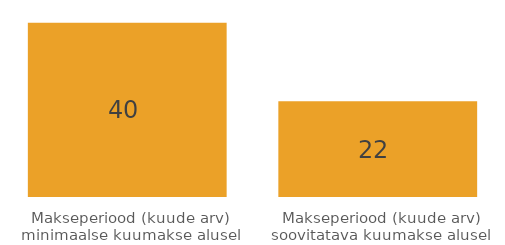
| Category | Series 0 |
|---|---|
| Makseperiood (kuude arv) minimaalse kuumakse alusel | 40 |
| Makseperiood (kuude arv) soovitatava kuumakse alusel | 22 |